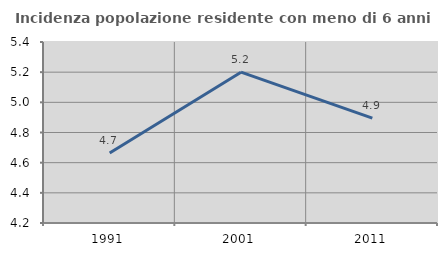
| Category | Incidenza popolazione residente con meno di 6 anni |
|---|---|
| 1991.0 | 4.664 |
| 2001.0 | 5.2 |
| 2011.0 | 4.895 |